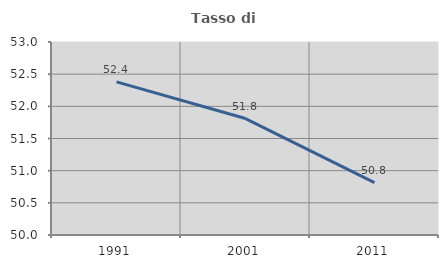
| Category | Tasso di occupazione   |
|---|---|
| 1991.0 | 52.381 |
| 2001.0 | 51.81 |
| 2011.0 | 50.815 |